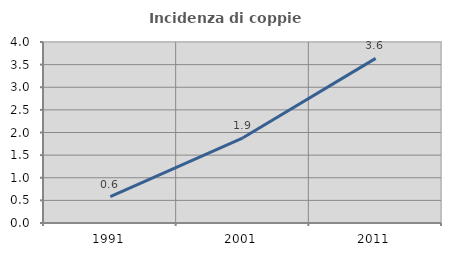
| Category | Incidenza di coppie miste |
|---|---|
| 1991.0 | 0.582 |
| 2001.0 | 1.883 |
| 2011.0 | 3.638 |